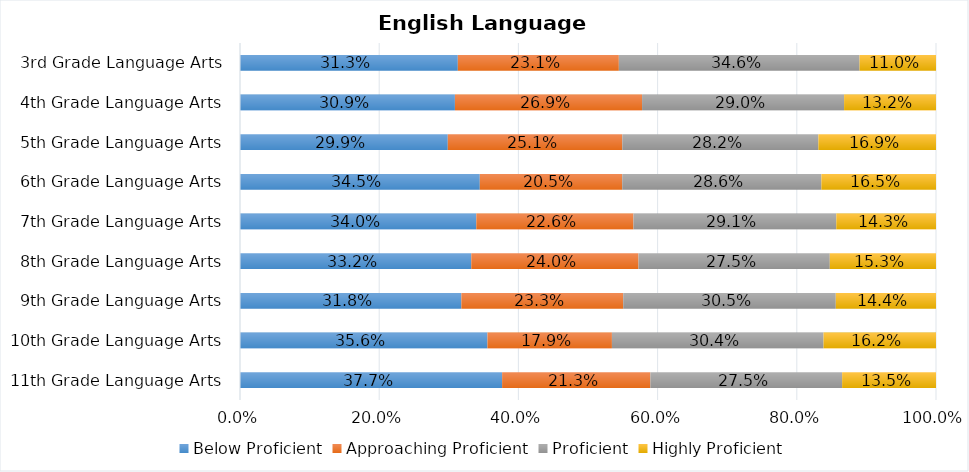
| Category | Below Proficient | Approaching Proficient | Proficient | Highly Proficient |
|---|---|---|---|---|
| 11th Grade Language Arts | 0.377 | 0.213 | 0.275 | 0.135 |
| 10th Grade Language Arts | 0.356 | 0.179 | 0.304 | 0.162 |
| 9th Grade Language Arts | 0.318 | 0.233 | 0.305 | 0.144 |
| 8th Grade Language Arts | 0.332 | 0.24 | 0.275 | 0.153 |
| 7th Grade Language Arts | 0.34 | 0.226 | 0.291 | 0.143 |
| 6th Grade Language Arts | 0.345 | 0.205 | 0.286 | 0.165 |
| 5th Grade Language Arts | 0.299 | 0.251 | 0.282 | 0.169 |
| 4th Grade Language Arts | 0.309 | 0.269 | 0.29 | 0.132 |
| 3rd Grade Language Arts | 0.313 | 0.231 | 0.346 | 0.11 |